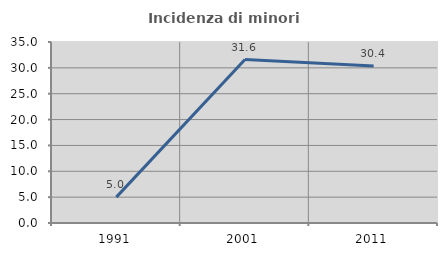
| Category | Incidenza di minori stranieri |
|---|---|
| 1991.0 | 5 |
| 2001.0 | 31.613 |
| 2011.0 | 30.353 |